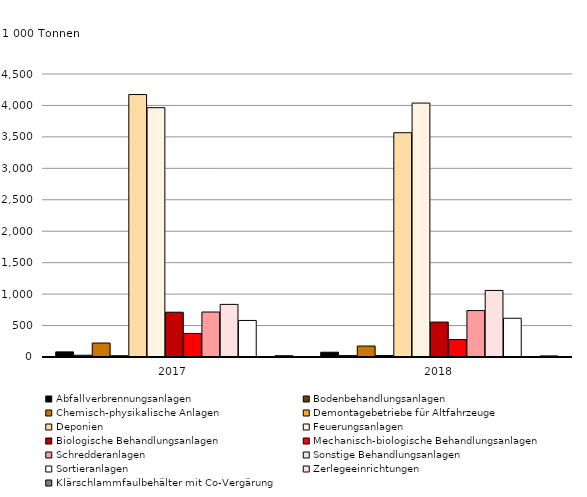
| Category | Abfallverbrennungsanlagen | Bodenbehandlungsanlagen | Chemisch-physikalische Anlagen | Demontagebetriebe für Altfahrzeuge | Deponien | Feuerungsanlagen | Biologische Behandlungsanlagen | Mechanisch-biologische Behandlungsanlagen | Schredderanlagen | Sonstige Behandlungsanlagen | Sortieranlagen | Zerlegeeinrichtungen | Klärschlammfaulbehälter mit Co-Vergärung |
|---|---|---|---|---|---|---|---|---|---|---|---|---|---|
| 2017.0 | 81055 | 27881 | 222136 | 20359 | 4173412 | 3964180 | 712306 | 374610 | 715135 | 836701 | 581200 | 1794 | 20533 |
| 2018.0 | 75793 | 22331 | 174504 | 24050 | 3566389 | 4037668 | 555337 | 276924 | 738261 | 1058314 | 615777 | 1585 | 17254 |